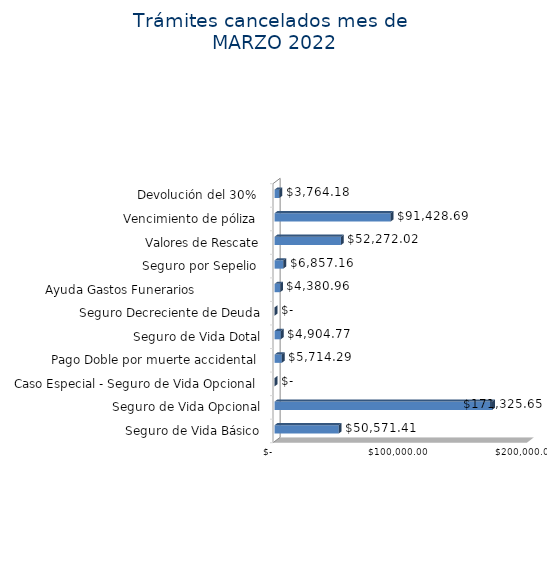
| Category | Monto  |
|---|---|
| Seguro de Vida Básico | 50571.41 |
| Seguro de Vida Opcional | 171325.65 |
| Caso Especial - Seguro de Vida Opcional  | 0 |
| Pago Doble por muerte accidental  | 5714.29 |
| Seguro de Vida Dotal | 4904.77 |
| Seguro Decreciente de Deuda | 0 |
| Ayuda Gastos Funerarios                  | 4380.96 |
| Seguro por Sepelio  | 6857.16 |
| Valores de Rescate | 52272.02 |
| Vencimiento de póliza  | 91428.69 |
| Devolución del 30%  | 3764.18 |